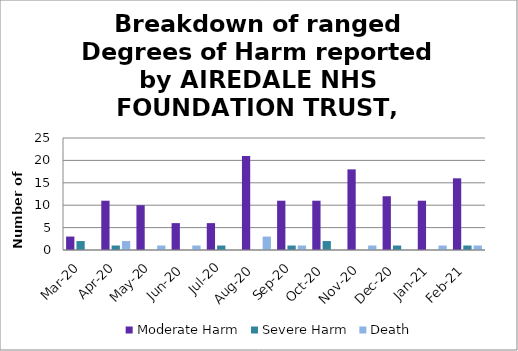
| Category | Moderate Harm | Severe Harm | Death |
|---|---|---|---|
| Mar-20 | 3 | 2 | 0 |
| Apr-20 | 11 | 1 | 2 |
| May-20 | 10 | 0 | 1 |
| Jun-20 | 6 | 0 | 1 |
| Jul-20 | 6 | 1 | 0 |
| Aug-20 | 21 | 0 | 3 |
| Sep-20 | 11 | 1 | 1 |
| Oct-20 | 11 | 2 | 0 |
| Nov-20 | 18 | 0 | 1 |
| Dec-20 | 12 | 1 | 0 |
| Jan-21 | 11 | 0 | 1 |
| Feb-21 | 16 | 1 | 1 |